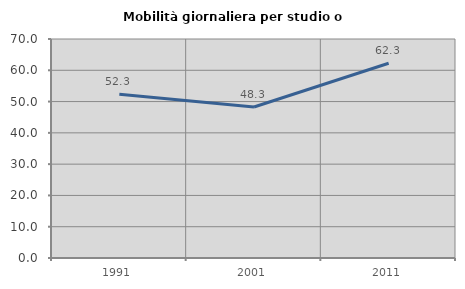
| Category | Mobilità giornaliera per studio o lavoro |
|---|---|
| 1991.0 | 52.305 |
| 2001.0 | 48.257 |
| 2011.0 | 62.26 |